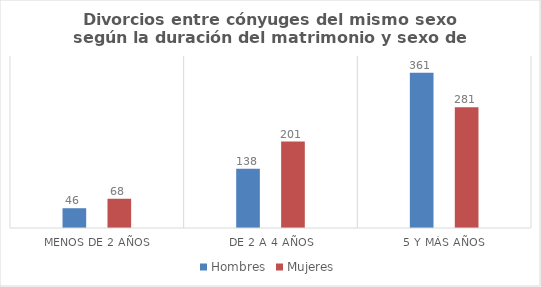
| Category | Hombres | Mujeres |
|---|---|---|
| Menos de 2 años | 46 | 68 |
| De 2 a 4 años | 138 | 201 |
| 5 y más años | 361 | 281 |